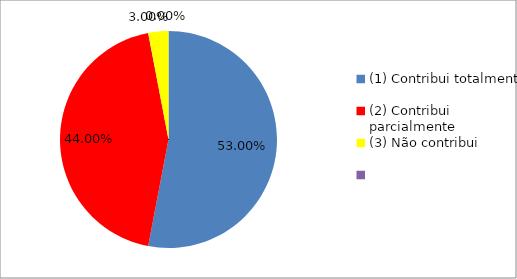
| Category | Series 0 |
|---|---|
| (1) Contribui totalmente | 0.53 |
| (2) Contribui parcialmente | 0.44 |
| (3) Não contribui | 0.03 |